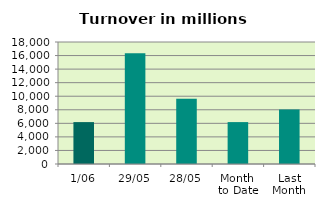
| Category | Series 0 |
|---|---|
| 1/06 | 6181.824 |
| 29/05 | 16329.82 |
| 28/05 | 9615.348 |
| Month 
to Date | 6181.824 |
| Last
Month | 8023.22 |